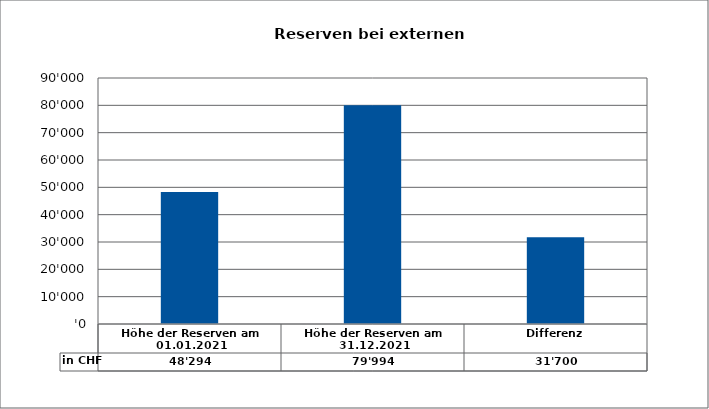
| Category | in CHF |
|---|---|
| Höhe der Reserven am 01.01.2021 | 48294 |
| Höhe der Reserven am 31.12.2021 | 79994.14 |
| Differenz | 31700.14 |